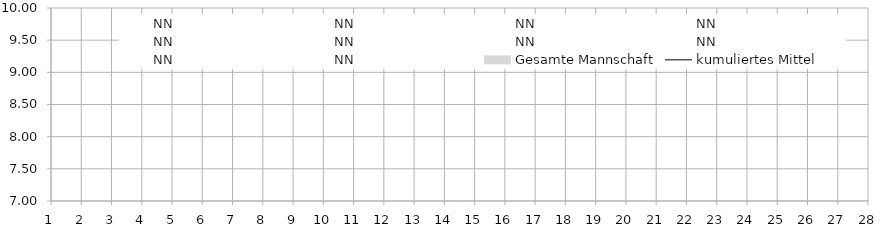
| Category | NN | Gesamte Mannschaft | kumuliertes Mittel |
|---|---|---|---|
| 0 | 0 | 0 | 0 |
| 1 | 0 | 0 | 0 |
| 2 | 0 | 0 | 0 |
| 3 | 0 | 0 | 0 |
| 4 | 0 | 0 | 0 |
| 5 | 0 | 0 | 0 |
| 6 | 0 | 0 | 0 |
| 7 | 0 | 0 | 0 |
| 8 | 0 | 0 | 0 |
| 9 | 0 | 0 | 0 |
| 10 | 0 | 0 | 0 |
| 11 | 0 | 0 | 0 |
| 12 | 0 | 0 | 0 |
| 13 | 0 | 0 | 0 |
| 14 | 0 | 0 | 0 |
| 15 | 0 | 0 | 0 |
| 16 | 0 | 0 | 0 |
| 17 | 0 | 0 | 0 |
| 18 | 0 | 0 | 0 |
| 19 | 0 | 0 | 0 |
| 20 | 0 | 0 | 0 |
| 21 | 0 | 0 | 0 |
| 22 | 0 | 0 | 0 |
| 23 | 0 | 0 | 0 |
| 24 | 0 | 0 | 0 |
| 25 | 0 | 0 | 0 |
| 26 | 0 | 0 | 0 |
| 27 | 0 | 0 | 0 |